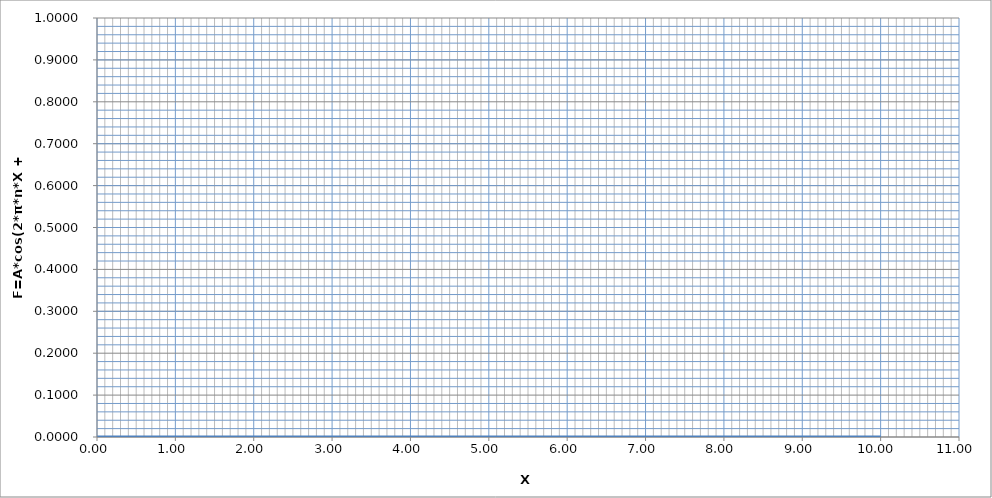
| Category | F=A*cos(2*π*n*Х + φ) |
|---|---|
| 0.0 | 0 |
| 0.01 | 0 |
| 0.02 | 0 |
| 0.03 | 0 |
| 0.04 | 0 |
| 0.05 | 0 |
| 0.060000000000000005 | 0 |
| 0.07 | 0 |
| 0.08 | 0 |
| 0.09 | 0 |
| 0.09999999999999999 | 0 |
| 0.10999999999999999 | 0 |
| 0.11999999999999998 | 0 |
| 0.12999999999999998 | 0 |
| 0.13999999999999999 | 0 |
| 0.15 | 0 |
| 0.16 | 0 |
| 0.17 | 0 |
| 0.18000000000000002 | 0 |
| 0.19000000000000003 | 0 |
| 0.20000000000000004 | 0 |
| 0.21000000000000005 | 0 |
| 0.22000000000000006 | 0 |
| 0.23000000000000007 | 0 |
| 0.24000000000000007 | 0 |
| 0.25000000000000006 | 0 |
| 0.26000000000000006 | 0 |
| 0.2700000000000001 | 0 |
| 0.2800000000000001 | 0 |
| 0.2900000000000001 | 0 |
| 0.3000000000000001 | 0 |
| 0.3100000000000001 | 0 |
| 0.3200000000000001 | 0 |
| 0.3300000000000001 | 0 |
| 0.34000000000000014 | 0 |
| 0.35000000000000014 | 0 |
| 0.36000000000000015 | 0 |
| 0.37000000000000016 | 0 |
| 0.38000000000000017 | 0 |
| 0.3900000000000002 | 0 |
| 0.4000000000000002 | 0 |
| 0.4100000000000002 | 0 |
| 0.4200000000000002 | 0 |
| 0.4300000000000002 | 0 |
| 0.4400000000000002 | 0 |
| 0.45000000000000023 | 0 |
| 0.46000000000000024 | 0 |
| 0.47000000000000025 | 0 |
| 0.48000000000000026 | 0 |
| 0.49000000000000027 | 0 |
| 0.5000000000000002 | 0 |
| 0.5100000000000002 | 0 |
| 0.5200000000000002 | 0 |
| 0.5300000000000002 | 0 |
| 0.5400000000000003 | 0 |
| 0.5500000000000003 | 0 |
| 0.5600000000000003 | 0 |
| 0.5700000000000003 | 0 |
| 0.5800000000000003 | 0 |
| 0.5900000000000003 | 0 |
| 0.6000000000000003 | 0 |
| 0.6100000000000003 | 0 |
| 0.6200000000000003 | 0 |
| 0.6300000000000003 | 0 |
| 0.6400000000000003 | 0 |
| 0.6500000000000004 | 0 |
| 0.6600000000000004 | 0 |
| 0.6700000000000004 | 0 |
| 0.6800000000000004 | 0 |
| 0.6900000000000004 | 0 |
| 0.7000000000000004 | 0 |
| 0.7100000000000004 | 0 |
| 0.7200000000000004 | 0 |
| 0.7300000000000004 | 0 |
| 0.7400000000000004 | 0 |
| 0.7500000000000004 | 0 |
| 0.7600000000000005 | 0 |
| 0.7700000000000005 | 0 |
| 0.7800000000000005 | 0 |
| 0.7900000000000005 | 0 |
| 0.8000000000000005 | 0 |
| 0.8100000000000005 | 0 |
| 0.8200000000000005 | 0 |
| 0.8300000000000005 | 0 |
| 0.8400000000000005 | 0 |
| 0.8500000000000005 | 0 |
| 0.8600000000000005 | 0 |
| 0.8700000000000006 | 0 |
| 0.8800000000000006 | 0 |
| 0.8900000000000006 | 0 |
| 0.9000000000000006 | 0 |
| 0.9100000000000006 | 0 |
| 0.9200000000000006 | 0 |
| 0.9300000000000006 | 0 |
| 0.9400000000000006 | 0 |
| 0.9500000000000006 | 0 |
| 0.9600000000000006 | 0 |
| 0.9700000000000006 | 0 |
| 0.9800000000000006 | 0 |
| 0.9900000000000007 | 0 |
| 1.0000000000000007 | 0 |
| 1.0100000000000007 | 0 |
| 1.0200000000000007 | 0 |
| 1.0300000000000007 | 0 |
| 1.0400000000000007 | 0 |
| 1.0500000000000007 | 0 |
| 1.0600000000000007 | 0 |
| 1.0700000000000007 | 0 |
| 1.0800000000000007 | 0 |
| 1.0900000000000007 | 0 |
| 1.1000000000000008 | 0 |
| 1.1100000000000008 | 0 |
| 1.1200000000000008 | 0 |
| 1.1300000000000008 | 0 |
| 1.1400000000000008 | 0 |
| 1.1500000000000008 | 0 |
| 1.1600000000000008 | 0 |
| 1.1700000000000008 | 0 |
| 1.1800000000000008 | 0 |
| 1.1900000000000008 | 0 |
| 1.2000000000000008 | 0 |
| 1.2100000000000009 | 0 |
| 1.2200000000000009 | 0 |
| 1.2300000000000009 | 0 |
| 1.2400000000000009 | 0 |
| 1.2500000000000009 | 0 |
| 1.260000000000001 | 0 |
| 1.270000000000001 | 0 |
| 1.280000000000001 | 0 |
| 1.290000000000001 | 0 |
| 1.300000000000001 | 0 |
| 1.310000000000001 | 0 |
| 1.320000000000001 | 0 |
| 1.330000000000001 | 0 |
| 1.340000000000001 | 0 |
| 1.350000000000001 | 0 |
| 1.360000000000001 | 0 |
| 1.370000000000001 | 0 |
| 1.380000000000001 | 0 |
| 1.390000000000001 | 0 |
| 1.400000000000001 | 0 |
| 1.410000000000001 | 0 |
| 1.420000000000001 | 0 |
| 1.430000000000001 | 0 |
| 1.440000000000001 | 0 |
| 1.450000000000001 | 0 |
| 1.460000000000001 | 0 |
| 1.470000000000001 | 0 |
| 1.480000000000001 | 0 |
| 1.490000000000001 | 0 |
| 1.500000000000001 | 0 |
| 1.5100000000000011 | 0 |
| 1.5200000000000011 | 0 |
| 1.5300000000000011 | 0 |
| 1.5400000000000011 | 0 |
| 1.5500000000000012 | 0 |
| 1.5600000000000012 | 0 |
| 1.5700000000000012 | 0 |
| 1.5800000000000012 | 0 |
| 1.5900000000000012 | 0 |
| 1.6000000000000012 | 0 |
| 1.6100000000000012 | 0 |
| 1.6200000000000012 | 0 |
| 1.6300000000000012 | 0 |
| 1.6400000000000012 | 0 |
| 1.6500000000000012 | 0 |
| 1.6600000000000013 | 0 |
| 1.6700000000000013 | 0 |
| 1.6800000000000013 | 0 |
| 1.6900000000000013 | 0 |
| 1.7000000000000013 | 0 |
| 1.7100000000000013 | 0 |
| 1.7200000000000013 | 0 |
| 1.7300000000000013 | 0 |
| 1.7400000000000013 | 0 |
| 1.7500000000000013 | 0 |
| 1.7600000000000013 | 0 |
| 1.7700000000000014 | 0 |
| 1.7800000000000014 | 0 |
| 1.7900000000000014 | 0 |
| 1.8000000000000014 | 0 |
| 1.8100000000000014 | 0 |
| 1.8200000000000014 | 0 |
| 1.8300000000000014 | 0 |
| 1.8400000000000014 | 0 |
| 1.8500000000000014 | 0 |
| 1.8600000000000014 | 0 |
| 1.8700000000000014 | 0 |
| 1.8800000000000014 | 0 |
| 1.8900000000000015 | 0 |
| 1.9000000000000015 | 0 |
| 1.9100000000000015 | 0 |
| 1.9200000000000015 | 0 |
| 1.9300000000000015 | 0 |
| 1.9400000000000015 | 0 |
| 1.9500000000000015 | 0 |
| 1.9600000000000015 | 0 |
| 1.9700000000000015 | 0 |
| 1.9800000000000015 | 0 |
| 1.9900000000000015 | 0 |
| 2.0000000000000013 | 0 |
| 2.010000000000001 | 0 |
| 2.020000000000001 | 0 |
| 2.0300000000000007 | 0 |
| 2.0400000000000005 | 0 |
| 2.0500000000000003 | 0 |
| 2.06 | 0 |
| 2.07 | 0 |
| 2.0799999999999996 | 0 |
| 2.0899999999999994 | 0 |
| 2.099999999999999 | 0 |
| 2.109999999999999 | 0 |
| 2.1199999999999988 | 0 |
| 2.1299999999999986 | 0 |
| 2.1399999999999983 | 0 |
| 2.149999999999998 | 0 |
| 2.159999999999998 | 0 |
| 2.1699999999999977 | 0 |
| 2.1799999999999975 | 0 |
| 2.1899999999999973 | 0 |
| 2.199999999999997 | 0 |
| 2.209999999999997 | 0 |
| 2.2199999999999966 | 0 |
| 2.2299999999999964 | 0 |
| 2.239999999999996 | 0 |
| 2.249999999999996 | 0 |
| 2.259999999999996 | 0 |
| 2.2699999999999956 | 0 |
| 2.2799999999999954 | 0 |
| 2.289999999999995 | 0 |
| 2.299999999999995 | 0 |
| 2.3099999999999947 | 0 |
| 2.3199999999999945 | 0 |
| 2.3299999999999943 | 0 |
| 2.339999999999994 | 0 |
| 2.349999999999994 | 0 |
| 2.3599999999999937 | 0 |
| 2.3699999999999934 | 0 |
| 2.3799999999999932 | 0 |
| 2.389999999999993 | 0 |
| 2.399999999999993 | 0 |
| 2.4099999999999926 | 0 |
| 2.4199999999999924 | 0 |
| 2.429999999999992 | 0 |
| 2.439999999999992 | 0 |
| 2.4499999999999917 | 0 |
| 2.4599999999999915 | 0 |
| 2.4699999999999913 | 0 |
| 2.479999999999991 | 0 |
| 2.489999999999991 | 0 |
| 2.4999999999999907 | 0 |
| 2.5099999999999905 | 0 |
| 2.5199999999999902 | 0 |
| 2.52999999999999 | 0 |
| 2.53999999999999 | 0 |
| 2.5499999999999896 | 0 |
| 2.5599999999999894 | 0 |
| 2.569999999999989 | 0 |
| 2.579999999999989 | 0 |
| 2.5899999999999888 | 0 |
| 2.5999999999999885 | 0 |
| 2.6099999999999883 | 0 |
| 2.619999999999988 | 0 |
| 2.629999999999988 | 0 |
| 2.6399999999999877 | 0 |
| 2.6499999999999875 | 0 |
| 2.6599999999999873 | 0 |
| 2.669999999999987 | 0 |
| 2.679999999999987 | 0 |
| 2.6899999999999866 | 0 |
| 2.6999999999999864 | 0 |
| 2.709999999999986 | 0 |
| 2.719999999999986 | 0 |
| 2.7299999999999858 | 0 |
| 2.7399999999999856 | 0 |
| 2.7499999999999853 | 0 |
| 2.759999999999985 | 0 |
| 2.769999999999985 | 0 |
| 2.7799999999999847 | 0 |
| 2.7899999999999845 | 0 |
| 2.7999999999999843 | 0 |
| 2.809999999999984 | 0 |
| 2.819999999999984 | 0 |
| 2.8299999999999836 | 0 |
| 2.8399999999999834 | 0 |
| 2.849999999999983 | 0 |
| 2.859999999999983 | 0 |
| 2.869999999999983 | 0 |
| 2.8799999999999826 | 0 |
| 2.8899999999999824 | 0 |
| 2.899999999999982 | 0 |
| 2.909999999999982 | 0 |
| 2.9199999999999817 | 0 |
| 2.9299999999999815 | 0 |
| 2.9399999999999813 | 0 |
| 2.949999999999981 | 0 |
| 2.959999999999981 | 0 |
| 2.9699999999999807 | 0 |
| 2.9799999999999804 | 0 |
| 2.9899999999999802 | 0 |
| 2.99999999999998 | 0 |
| 3.00999999999998 | 0 |
| 3.0199999999999796 | 0 |
| 3.0299999999999794 | 0 |
| 3.039999999999979 | 0 |
| 3.049999999999979 | 0 |
| 3.0599999999999787 | 0 |
| 3.0699999999999785 | 0 |
| 3.0799999999999783 | 0 |
| 3.089999999999978 | 0 |
| 3.099999999999978 | 0 |
| 3.1099999999999777 | 0 |
| 3.1199999999999775 | 0 |
| 3.1299999999999772 | 0 |
| 3.139999999999977 | 0 |
| 3.149999999999977 | 0 |
| 3.1599999999999766 | 0 |
| 3.1699999999999764 | 0 |
| 3.179999999999976 | 0 |
| 3.189999999999976 | 0 |
| 3.1999999999999758 | 0 |
| 3.2099999999999755 | 0 |
| 3.2199999999999753 | 0 |
| 3.229999999999975 | 0 |
| 3.239999999999975 | 0 |
| 3.2499999999999747 | 0 |
| 3.2599999999999745 | 0 |
| 3.2699999999999743 | 0 |
| 3.279999999999974 | 0 |
| 3.289999999999974 | 0 |
| 3.2999999999999736 | 0 |
| 3.3099999999999734 | 0 |
| 3.319999999999973 | 0 |
| 3.329999999999973 | 0 |
| 3.3399999999999728 | 0 |
| 3.3499999999999726 | 0 |
| 3.3599999999999723 | 0 |
| 3.369999999999972 | 0 |
| 3.379999999999972 | 0 |
| 3.3899999999999717 | 0 |
| 3.3999999999999715 | 0 |
| 3.4099999999999713 | 0 |
| 3.419999999999971 | 0 |
| 3.429999999999971 | 0 |
| 3.4399999999999706 | 0 |
| 3.4499999999999704 | 0 |
| 3.45999999999997 | 0 |
| 3.46999999999997 | 0 |
| 3.47999999999997 | 0 |
| 3.4899999999999696 | 0 |
| 3.4999999999999694 | 0 |
| 3.509999999999969 | 0 |
| 3.519999999999969 | 0 |
| 3.5299999999999687 | 0 |
| 3.5399999999999685 | 0 |
| 3.5499999999999683 | 0 |
| 3.559999999999968 | 0 |
| 3.569999999999968 | 0 |
| 3.5799999999999677 | 0 |
| 3.5899999999999674 | 0 |
| 3.5999999999999672 | 0 |
| 3.609999999999967 | 0 |
| 3.619999999999967 | 0 |
| 3.6299999999999666 | 0 |
| 3.6399999999999664 | 0 |
| 3.649999999999966 | 0 |
| 3.659999999999966 | 0 |
| 3.6699999999999657 | 0 |
| 3.6799999999999655 | 0 |
| 3.6899999999999653 | 0 |
| 3.699999999999965 | 0 |
| 3.709999999999965 | 0 |
| 3.7199999999999647 | 0 |
| 3.7299999999999645 | 0 |
| 3.7399999999999642 | 0 |
| 3.749999999999964 | 0 |
| 3.759999999999964 | 0 |
| 3.7699999999999636 | 0 |
| 3.7799999999999634 | 0 |
| 3.789999999999963 | 0 |
| 3.799999999999963 | 0 |
| 3.8099999999999627 | 0 |
| 3.8199999999999625 | 0 |
| 3.8299999999999623 | 0 |
| 3.839999999999962 | 0 |
| 3.849999999999962 | 0 |
| 3.8599999999999617 | 0 |
| 3.8699999999999615 | 0 |
| 3.8799999999999613 | 0 |
| 3.889999999999961 | 0 |
| 3.899999999999961 | 0 |
| 3.9099999999999606 | 0 |
| 3.9199999999999604 | 0 |
| 3.92999999999996 | 0 |
| 3.93999999999996 | 0 |
| 3.9499999999999598 | 0 |
| 3.9599999999999596 | 0 |
| 3.9699999999999593 | 0 |
| 3.979999999999959 | 0 |
| 3.989999999999959 | 0 |
| 3.9999999999999587 | 0 |
| 4.009999999999959 | 0 |
| 4.019999999999959 | 0 |
| 4.0299999999999585 | 0 |
| 4.039999999999958 | 0 |
| 4.049999999999958 | 0 |
| 4.059999999999958 | 0 |
| 4.069999999999958 | 0 |
| 4.079999999999957 | 0 |
| 4.089999999999957 | 0 |
| 4.099999999999957 | 0 |
| 4.109999999999957 | 0 |
| 4.119999999999957 | 0 |
| 4.129999999999956 | 0 |
| 4.139999999999956 | 0 |
| 4.149999999999956 | 0 |
| 4.159999999999956 | 0 |
| 4.1699999999999555 | 0 |
| 4.179999999999955 | 0 |
| 4.189999999999955 | 0 |
| 4.199999999999955 | 0 |
| 4.209999999999955 | 0 |
| 4.2199999999999545 | 0 |
| 4.229999999999954 | 0 |
| 4.239999999999954 | 0 |
| 4.249999999999954 | 0 |
| 4.259999999999954 | 0 |
| 4.269999999999953 | 0 |
| 4.279999999999953 | 0 |
| 4.289999999999953 | 0 |
| 4.299999999999953 | 0 |
| 4.3099999999999525 | 0 |
| 4.319999999999952 | 0 |
| 4.329999999999952 | 0 |
| 4.339999999999952 | 0 |
| 4.349999999999952 | 0 |
| 4.3599999999999515 | 0 |
| 4.369999999999951 | 0 |
| 4.379999999999951 | 0 |
| 4.389999999999951 | 0 |
| 4.399999999999951 | 0 |
| 4.40999999999995 | 0 |
| 4.41999999999995 | 0 |
| 4.42999999999995 | 0 |
| 4.43999999999995 | 0 |
| 4.4499999999999496 | 0 |
| 4.459999999999949 | 0 |
| 4.469999999999949 | 0 |
| 4.479999999999949 | 0 |
| 4.489999999999949 | 0 |
| 4.4999999999999485 | 0 |
| 4.509999999999948 | 0 |
| 4.519999999999948 | 0 |
| 4.529999999999948 | 0 |
| 4.539999999999948 | 0 |
| 4.549999999999947 | 0 |
| 4.559999999999947 | 0 |
| 4.569999999999947 | 0 |
| 4.579999999999947 | 0 |
| 4.589999999999947 | 0 |
| 4.599999999999946 | 0 |
| 4.609999999999946 | 0 |
| 4.619999999999946 | 0 |
| 4.629999999999946 | 0 |
| 4.6399999999999455 | 0 |
| 4.649999999999945 | 0 |
| 4.659999999999945 | 0 |
| 4.669999999999945 | 0 |
| 4.679999999999945 | 0 |
| 4.689999999999944 | 0 |
| 4.699999999999944 | 0 |
| 4.709999999999944 | 0 |
| 4.719999999999944 | 0 |
| 4.729999999999944 | 0 |
| 4.739999999999943 | 0 |
| 4.749999999999943 | 0 |
| 4.759999999999943 | 0 |
| 4.769999999999943 | 0 |
| 4.7799999999999425 | 0 |
| 4.789999999999942 | 0 |
| 4.799999999999942 | 0 |
| 4.809999999999942 | 0 |
| 4.819999999999942 | 0 |
| 4.8299999999999415 | 0 |
| 4.839999999999941 | 0 |
| 4.849999999999941 | 0 |
| 4.859999999999941 | 0 |
| 4.869999999999941 | 0 |
| 4.87999999999994 | 0 |
| 4.88999999999994 | 0 |
| 4.89999999999994 | 0 |
| 4.90999999999994 | 0 |
| 4.9199999999999395 | 0 |
| 4.929999999999939 | 0 |
| 4.939999999999939 | 0 |
| 4.949999999999939 | 0 |
| 4.959999999999939 | 0 |
| 4.9699999999999385 | 0 |
| 4.979999999999938 | 0 |
| 4.989999999999938 | 0 |
| 4.999999999999938 | 0 |
| 5.009999999999938 | 0 |
| 5.019999999999937 | 0 |
| 5.029999999999937 | 0 |
| 5.039999999999937 | 0 |
| 5.049999999999937 | 0 |
| 5.0599999999999365 | 0 |
| 5.069999999999936 | 0 |
| 5.079999999999936 | 0 |
| 5.089999999999936 | 0 |
| 5.099999999999936 | 0 |
| 5.1099999999999355 | 0 |
| 5.119999999999935 | 0 |
| 5.129999999999935 | 0 |
| 5.139999999999935 | 0 |
| 5.149999999999935 | 0 |
| 5.159999999999934 | 0 |
| 5.169999999999934 | 0 |
| 5.179999999999934 | 0 |
| 5.189999999999934 | 0 |
| 5.199999999999934 | 0 |
| 5.209999999999933 | 0 |
| 5.219999999999933 | 0 |
| 5.229999999999933 | 0 |
| 5.239999999999933 | 0 |
| 5.2499999999999325 | 0 |
| 5.259999999999932 | 0 |
| 5.269999999999932 | 0 |
| 5.279999999999932 | 0 |
| 5.289999999999932 | 0 |
| 5.299999999999931 | 0 |
| 5.309999999999931 | 0 |
| 5.319999999999931 | 0 |
| 5.329999999999931 | 0 |
| 5.339999999999931 | 0 |
| 5.34999999999993 | 0 |
| 5.35999999999993 | 0 |
| 5.36999999999993 | 0 |
| 5.37999999999993 | 0 |
| 5.3899999999999295 | 0 |
| 5.399999999999929 | 0 |
| 5.409999999999929 | 0 |
| 5.419999999999929 | 0 |
| 5.429999999999929 | 0 |
| 5.4399999999999284 | 0 |
| 5.449999999999928 | 0 |
| 5.459999999999928 | 0 |
| 5.469999999999928 | 0 |
| 5.479999999999928 | 0 |
| 5.489999999999927 | 0 |
| 5.499999999999927 | 0 |
| 5.509999999999927 | 0 |
| 5.519999999999927 | 0 |
| 5.5299999999999265 | 0 |
| 5.539999999999926 | 0 |
| 5.549999999999926 | 0 |
| 5.559999999999926 | 0 |
| 5.569999999999926 | 0 |
| 5.5799999999999255 | 0 |
| 5.589999999999925 | 0 |
| 5.599999999999925 | 0 |
| 5.609999999999925 | 0 |
| 5.619999999999925 | 0 |
| 5.629999999999924 | 0 |
| 5.639999999999924 | 0 |
| 5.649999999999924 | 0 |
| 5.659999999999924 | 0 |
| 5.6699999999999235 | 0 |
| 5.679999999999923 | 0 |
| 5.689999999999923 | 0 |
| 5.699999999999923 | 0 |
| 5.709999999999923 | 0 |
| 5.7199999999999225 | 0 |
| 5.729999999999922 | 0 |
| 5.739999999999922 | 0 |
| 5.749999999999922 | 0 |
| 5.759999999999922 | 0 |
| 5.769999999999921 | 0 |
| 5.779999999999921 | 0 |
| 5.789999999999921 | 0 |
| 5.799999999999921 | 0 |
| 5.809999999999921 | 0 |
| 5.81999999999992 | 0 |
| 5.82999999999992 | 0 |
| 5.83999999999992 | 0 |
| 5.84999999999992 | 0 |
| 5.8599999999999195 | 0 |
| 5.869999999999919 | 0 |
| 5.879999999999919 | 0 |
| 5.889999999999919 | 0 |
| 5.899999999999919 | 0 |
| 5.909999999999918 | 0 |
| 5.919999999999918 | 0 |
| 5.929999999999918 | 0 |
| 5.939999999999918 | 0 |
| 5.949999999999918 | 0 |
| 5.959999999999917 | 0 |
| 5.969999999999917 | 0 |
| 5.979999999999917 | 0 |
| 5.989999999999917 | 0 |
| 5.9999999999999165 | 0 |
| 6.009999999999916 | 0 |
| 6.019999999999916 | 0 |
| 6.029999999999916 | 0 |
| 6.039999999999916 | 0 |
| 6.0499999999999154 | 0 |
| 6.059999999999915 | 0 |
| 6.069999999999915 | 0 |
| 6.079999999999915 | 0 |
| 6.089999999999915 | 0 |
| 6.099999999999914 | 0 |
| 6.109999999999914 | 0 |
| 6.119999999999914 | 0 |
| 6.129999999999914 | 0 |
| 6.1399999999999135 | 0 |
| 6.149999999999913 | 0 |
| 6.159999999999913 | 0 |
| 6.169999999999913 | 0 |
| 6.179999999999913 | 0 |
| 6.1899999999999125 | 0 |
| 6.199999999999912 | 0 |
| 6.209999999999912 | 0 |
| 6.219999999999912 | 0 |
| 6.229999999999912 | 0 |
| 6.239999999999911 | 0 |
| 6.249999999999911 | 0 |
| 6.259999999999911 | 0 |
| 6.269999999999911 | 0 |
| 6.2799999999999105 | 0 |
| 6.28999999999991 | 0 |
| 6.29999999999991 | 0 |
| 6.30999999999991 | 0 |
| 6.31999999999991 | 0 |
| 6.3299999999999095 | 0 |
| 6.339999999999909 | 0 |
| 6.349999999999909 | 0 |
| 6.359999999999909 | 0 |
| 6.369999999999909 | 0 |
| 6.379999999999908 | 0 |
| 6.389999999999908 | 0 |
| 6.399999999999908 | 0 |
| 6.409999999999908 | 0 |
| 6.419999999999908 | 0 |
| 6.429999999999907 | 0 |
| 6.439999999999907 | 0 |
| 6.449999999999907 | 0 |
| 6.459999999999907 | 0 |
| 6.4699999999999065 | 0 |
| 6.479999999999906 | 0 |
| 6.489999999999906 | 0 |
| 6.499999999999906 | 0 |
| 6.509999999999906 | 0 |
| 6.519999999999905 | 0 |
| 6.529999999999905 | 0 |
| 6.539999999999905 | 0 |
| 6.549999999999905 | 0 |
| 6.559999999999905 | 0 |
| 6.569999999999904 | 0 |
| 6.579999999999904 | 0 |
| 6.589999999999904 | 0 |
| 6.599999999999904 | 0 |
| 6.6099999999999035 | 0 |
| 6.619999999999903 | 0 |
| 6.629999999999903 | 0 |
| 6.639999999999903 | 0 |
| 6.649999999999903 | 0 |
| 6.659999999999902 | 0 |
| 6.669999999999902 | 0 |
| 6.679999999999902 | 0 |
| 6.689999999999902 | 0 |
| 6.699999999999902 | 0 |
| 6.709999999999901 | 0 |
| 6.719999999999901 | 0 |
| 6.729999999999901 | 0 |
| 6.739999999999901 | 0 |
| 6.7499999999999005 | 0 |
| 6.7599999999999 | 0 |
| 6.7699999999999 | 0 |
| 6.7799999999999 | 0 |
| 6.7899999999999 | 0 |
| 6.7999999999998995 | 0 |
| 6.809999999999899 | 0 |
| 6.819999999999899 | 0 |
| 6.829999999999899 | 0 |
| 6.839999999999899 | 0 |
| 6.849999999999898 | 0 |
| 6.859999999999898 | 0 |
| 6.869999999999898 | 0 |
| 6.879999999999898 | 0 |
| 6.8899999999998975 | 0 |
| 6.899999999999897 | 0 |
| 6.909999999999897 | 0 |
| 6.919999999999897 | 0 |
| 6.929999999999897 | 0 |
| 6.9399999999998965 | 0 |
| 6.949999999999896 | 0 |
| 6.959999999999896 | 0 |
| 6.969999999999896 | 0 |
| 6.979999999999896 | 0 |
| 6.989999999999895 | 0 |
| 6.999999999999895 | 0 |
| 7.009999999999895 | 0 |
| 7.019999999999895 | 0 |
| 7.0299999999998946 | 0 |
| 7.039999999999894 | 0 |
| 7.049999999999894 | 0 |
| 7.059999999999894 | 0 |
| 7.069999999999894 | 0 |
| 7.0799999999998935 | 0 |
| 7.089999999999893 | 0 |
| 7.099999999999893 | 0 |
| 7.109999999999893 | 0 |
| 7.119999999999893 | 0 |
| 7.129999999999892 | 0 |
| 7.139999999999892 | 0 |
| 7.149999999999892 | 0 |
| 7.159999999999892 | 0 |
| 7.169999999999892 | 0 |
| 7.179999999999891 | 0 |
| 7.189999999999891 | 0 |
| 7.199999999999891 | 0 |
| 7.209999999999891 | 0 |
| 7.2199999999998905 | 0 |
| 7.22999999999989 | 0 |
| 7.23999999999989 | 0 |
| 7.24999999999989 | 0 |
| 7.25999999999989 | 0 |
| 7.269999999999889 | 0 |
| 7.279999999999889 | 0 |
| 7.289999999999889 | 0 |
| 7.299999999999889 | 0 |
| 7.309999999999889 | 0 |
| 7.319999999999888 | 0 |
| 7.329999999999888 | 0 |
| 7.339999999999888 | 0 |
| 7.349999999999888 | 0 |
| 7.3599999999998875 | 0 |
| 7.369999999999887 | 0 |
| 7.379999999999887 | 0 |
| 7.389999999999887 | 0 |
| 7.399999999999887 | 0 |
| 7.4099999999998865 | 0 |
| 7.419999999999886 | 0 |
| 7.429999999999886 | 0 |
| 7.439999999999886 | 0 |
| 7.449999999999886 | 0 |
| 7.459999999999885 | 0 |
| 7.469999999999885 | 0 |
| 7.479999999999885 | 0 |
| 7.489999999999885 | 0 |
| 7.4999999999998845 | 0 |
| 7.509999999999884 | 0 |
| 7.519999999999884 | 0 |
| 7.529999999999884 | 0 |
| 7.539999999999884 | 0 |
| 7.5499999999998835 | 0 |
| 7.559999999999883 | 0 |
| 7.569999999999883 | 0 |
| 7.579999999999883 | 0 |
| 7.589999999999883 | 0 |
| 7.599999999999882 | 0 |
| 7.609999999999882 | 0 |
| 7.619999999999882 | 0 |
| 7.629999999999882 | 0 |
| 7.6399999999998816 | 0 |
| 7.649999999999881 | 0 |
| 7.659999999999881 | 0 |
| 7.669999999999881 | 0 |
| 7.679999999999881 | 0 |
| 7.6899999999998805 | 0 |
| 7.69999999999988 | 0 |
| 7.70999999999988 | 0 |
| 7.71999999999988 | 0 |
| 7.72999999999988 | 0 |
| 7.739999999999879 | 0 |
| 7.749999999999879 | 0 |
| 7.759999999999879 | 0 |
| 7.769999999999879 | 0 |
| 7.779999999999879 | 0 |
| 7.789999999999878 | 0 |
| 7.799999999999878 | 0 |
| 7.809999999999878 | 0 |
| 7.819999999999878 | 0 |
| 7.8299999999998775 | 0 |
| 7.839999999999877 | 0 |
| 7.849999999999877 | 0 |
| 7.859999999999877 | 0 |
| 7.869999999999877 | 0 |
| 7.879999999999876 | 0 |
| 7.889999999999876 | 0 |
| 7.899999999999876 | 0 |
| 7.909999999999876 | 0 |
| 7.919999999999876 | 0 |
| 7.929999999999875 | 0 |
| 7.939999999999875 | 0 |
| 7.949999999999875 | 0 |
| 7.959999999999875 | 0 |
| 7.9699999999998745 | 0 |
| 7.979999999999874 | 0 |
| 7.989999999999874 | 0 |
| 7.999999999999874 | 0 |
| 8.009999999999874 | 0 |
| 8.019999999999873 | 0 |
| 8.029999999999873 | 0 |
| 8.039999999999873 | 0 |
| 8.049999999999873 | 0 |
| 8.059999999999873 | 0 |
| 8.069999999999872 | 0 |
| 8.079999999999872 | 0 |
| 8.089999999999872 | 0 |
| 8.099999999999872 | 0 |
| 8.109999999999872 | 0 |
| 8.119999999999871 | 0 |
| 8.129999999999871 | 0 |
| 8.139999999999871 | 0 |
| 8.14999999999987 | 0 |
| 8.15999999999987 | 0 |
| 8.16999999999987 | 0 |
| 8.17999999999987 | 0 |
| 8.18999999999987 | 0 |
| 8.19999999999987 | 0 |
| 8.20999999999987 | 0 |
| 8.21999999999987 | 0 |
| 8.229999999999869 | 0 |
| 8.239999999999869 | 0 |
| 8.249999999999869 | 0 |
| 8.259999999999868 | 0 |
| 8.269999999999868 | 0 |
| 8.279999999999868 | 0 |
| 8.289999999999868 | 0 |
| 8.299999999999867 | 0 |
| 8.309999999999867 | 0 |
| 8.319999999999867 | 0 |
| 8.329999999999867 | 0 |
| 8.339999999999867 | 0 |
| 8.349999999999866 | 0 |
| 8.359999999999866 | 0 |
| 8.369999999999866 | 0 |
| 8.379999999999866 | 0 |
| 8.389999999999866 | 0 |
| 8.399999999999865 | 0 |
| 8.409999999999865 | 0 |
| 8.419999999999865 | 0 |
| 8.429999999999865 | 0 |
| 8.439999999999864 | 0 |
| 8.449999999999864 | 0 |
| 8.459999999999864 | 0 |
| 8.469999999999864 | 0 |
| 8.479999999999864 | 0 |
| 8.489999999999863 | 0 |
| 8.499999999999863 | 0 |
| 8.509999999999863 | 0 |
| 8.519999999999863 | 0 |
| 8.529999999999863 | 0 |
| 8.539999999999862 | 0 |
| 8.549999999999862 | 0 |
| 8.559999999999862 | 0 |
| 8.569999999999862 | 0 |
| 8.579999999999862 | 0 |
| 8.589999999999861 | 0 |
| 8.599999999999861 | 0 |
| 8.60999999999986 | 0 |
| 8.61999999999986 | 0 |
| 8.62999999999986 | 0 |
| 8.63999999999986 | 0 |
| 8.64999999999986 | 0 |
| 8.65999999999986 | 0 |
| 8.66999999999986 | 0 |
| 8.67999999999986 | 0 |
| 8.68999999999986 | 0 |
| 8.699999999999859 | 0 |
| 8.709999999999859 | 0 |
| 8.719999999999859 | 0 |
| 8.729999999999858 | 0 |
| 8.739999999999858 | 0 |
| 8.749999999999858 | 0 |
| 8.759999999999858 | 0 |
| 8.769999999999857 | 0 |
| 8.779999999999857 | 0 |
| 8.789999999999857 | 0 |
| 8.799999999999857 | 0 |
| 8.809999999999857 | 0 |
| 8.819999999999856 | 0 |
| 8.829999999999856 | 0 |
| 8.839999999999856 | 0 |
| 8.849999999999856 | 0 |
| 8.859999999999856 | 0 |
| 8.869999999999855 | 0 |
| 8.879999999999855 | 0 |
| 8.889999999999855 | 0 |
| 8.899999999999855 | 0 |
| 8.909999999999854 | 0 |
| 8.919999999999854 | 0 |
| 8.929999999999854 | 0 |
| 8.939999999999854 | 0 |
| 8.949999999999854 | 0 |
| 8.959999999999853 | 0 |
| 8.969999999999853 | 0 |
| 8.979999999999853 | 0 |
| 8.989999999999853 | 0 |
| 8.999999999999853 | 0 |
| 9.009999999999852 | 0 |
| 9.019999999999852 | 0 |
| 9.029999999999852 | 0 |
| 9.039999999999852 | 0 |
| 9.049999999999851 | 0 |
| 9.059999999999851 | 0 |
| 9.069999999999851 | 0 |
| 9.07999999999985 | 0 |
| 9.08999999999985 | 0 |
| 9.09999999999985 | 0 |
| 9.10999999999985 | 0 |
| 9.11999999999985 | 0 |
| 9.12999999999985 | 0 |
| 9.13999999999985 | 0 |
| 9.14999999999985 | 0 |
| 9.15999999999985 | 0 |
| 9.169999999999849 | 0 |
| 9.179999999999849 | 0 |
| 9.189999999999849 | 0 |
| 9.199999999999848 | 0 |
| 9.209999999999848 | 0 |
| 9.219999999999848 | 0 |
| 9.229999999999848 | 0 |
| 9.239999999999847 | 0 |
| 9.249999999999847 | 0 |
| 9.259999999999847 | 0 |
| 9.269999999999847 | 0 |
| 9.279999999999847 | 0 |
| 9.289999999999846 | 0 |
| 9.299999999999846 | 0 |
| 9.309999999999846 | 0 |
| 9.319999999999846 | 0 |
| 9.329999999999846 | 0 |
| 9.339999999999845 | 0 |
| 9.349999999999845 | 0 |
| 9.359999999999845 | 0 |
| 9.369999999999845 | 0 |
| 9.379999999999844 | 0 |
| 9.389999999999844 | 0 |
| 9.399999999999844 | 0 |
| 9.409999999999844 | 0 |
| 9.419999999999844 | 0 |
| 9.429999999999843 | 0 |
| 9.439999999999843 | 0 |
| 9.449999999999843 | 0 |
| 9.459999999999843 | 0 |
| 9.469999999999843 | 0 |
| 9.479999999999842 | 0 |
| 9.489999999999842 | 0 |
| 9.499999999999842 | 0 |
| 9.509999999999842 | 0 |
| 9.519999999999841 | 0 |
| 9.529999999999841 | 0 |
| 9.539999999999841 | 0 |
| 9.54999999999984 | 0 |
| 9.55999999999984 | 0 |
| 9.56999999999984 | 0 |
| 9.57999999999984 | 0 |
| 9.58999999999984 | 0 |
| 9.59999999999984 | 0 |
| 9.60999999999984 | 0 |
| 9.61999999999984 | 0 |
| 9.62999999999984 | 0 |
| 9.639999999999839 | 0 |
| 9.649999999999839 | 0 |
| 9.659999999999838 | 0 |
| 9.669999999999838 | 0 |
| 9.679999999999838 | 0 |
| 9.689999999999838 | 0 |
| 9.699999999999838 | 0 |
| 9.709999999999837 | 0 |
| 9.719999999999837 | 0 |
| 9.729999999999837 | 0 |
| 9.739999999999837 | 0 |
| 9.749999999999837 | 0 |
| 9.759999999999836 | 0 |
| 9.769999999999836 | 0 |
| 9.779999999999836 | 0 |
| 9.789999999999836 | 0 |
| 9.799999999999836 | 0 |
| 9.809999999999835 | 0 |
| 9.819999999999835 | 0 |
| 9.829999999999835 | 0 |
| 9.839999999999835 | 0 |
| 9.849999999999834 | 0 |
| 9.859999999999834 | 0 |
| 9.869999999999834 | 0 |
| 9.879999999999834 | 0 |
| 9.889999999999834 | 0 |
| 9.899999999999833 | 0 |
| 9.909999999999833 | 0 |
| 9.919999999999833 | 0 |
| 9.929999999999833 | 0 |
| 9.939999999999833 | 0 |
| 9.949999999999832 | 0 |
| 9.959999999999832 | 0 |
| 9.969999999999832 | 0 |
| 9.979999999999832 | 0 |
| 9.989999999999831 | 0 |
| 9.999999999999831 | 0 |